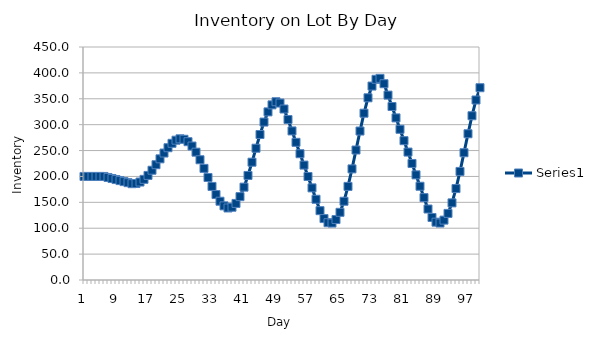
| Category | Series 0 |
|---|---|
| 0 | 200 |
| 1 | 200 |
| 2 | 200 |
| 3 | 200 |
| 4 | 200 |
| 5 | 200 |
| 6 | 198 |
| 7 | 196 |
| 8 | 194 |
| 9 | 192 |
| 10 | 190 |
| 11 | 188 |
| 12 | 186 |
| 13 | 186.4 |
| 14 | 189.2 |
| 15 | 194.4 |
| 16 | 202 |
| 17 | 212 |
| 18 | 222.667 |
| 19 | 234 |
| 20 | 245.2 |
| 21 | 255.467 |
| 22 | 264 |
| 23 | 270 |
| 24 | 272.667 |
| 25 | 271.778 |
| 26 | 267.111 |
| 27 | 258.711 |
| 28 | 246.889 |
| 29 | 232.222 |
| 30 | 215.556 |
| 31 | 198 |
| 32 | 180.741 |
| 33 | 165.037 |
| 34 | 152.133 |
| 35 | 143.17 |
| 36 | 139.096 |
| 37 | 140.578 |
| 38 | 147.911 |
| 39 | 160.998 |
| 40 | 179.319 |
| 41 | 201.941 |
| 42 | 227.551 |
| 43 | 254.519 |
| 44 | 280.993 |
| 45 | 305.022 |
| 46 | 324.69 |
| 47 | 338.25 |
| 48 | 344.27 |
| 49 | 341.753 |
| 50 | 330.247 |
| 51 | 309.916 |
| 52 | 287.916 |
| 53 | 265.916 |
| 54 | 243.916 |
| 55 | 221.916 |
| 56 | 199.916 |
| 57 | 177.916 |
| 58 | 155.916 |
| 59 | 133.916 |
| 60 | 118.611 |
| 61 | 110.639 |
| 62 | 110 |
| 63 | 116.695 |
| 64 | 130.723 |
| 65 | 152.084 |
| 66 | 180.779 |
| 67 | 214.575 |
| 68 | 251.029 |
| 69 | 287.695 |
| 70 | 322.131 |
| 71 | 351.89 |
| 72 | 374.528 |
| 73 | 387.602 |
| 74 | 389.411 |
| 75 | 379.068 |
| 76 | 357.068 |
| 77 | 335.068 |
| 78 | 313.068 |
| 79 | 291.068 |
| 80 | 269.068 |
| 81 | 247.068 |
| 82 | 225.068 |
| 83 | 203.068 |
| 84 | 181.068 |
| 85 | 159.068 |
| 86 | 137.068 |
| 87 | 120.712 |
| 88 | 111.689 |
| 89 | 110 |
| 90 | 115.644 |
| 91 | 128.622 |
| 92 | 148.932 |
| 93 | 176.577 |
| 94 | 209.673 |
| 95 | 245.776 |
| 96 | 282.443 |
| 97 | 317.228 |
| 98 | 347.688 |
| 99 | 371.377 |